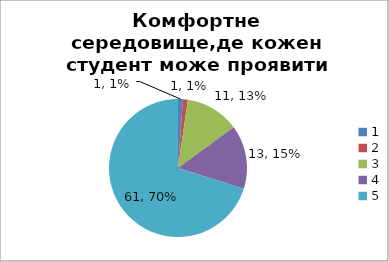
| Category | Кількість | % |
|---|---|---|
| 0 | 1 | 0.011 |
| 1 | 1 | 0.011 |
| 2 | 11 | 0.126 |
| 3 | 13 | 0.149 |
| 4 | 61 | 0.701 |